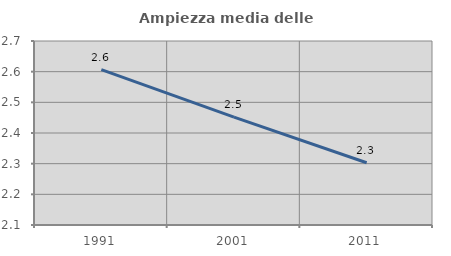
| Category | Ampiezza media delle famiglie |
|---|---|
| 1991.0 | 2.607 |
| 2001.0 | 2.452 |
| 2011.0 | 2.303 |